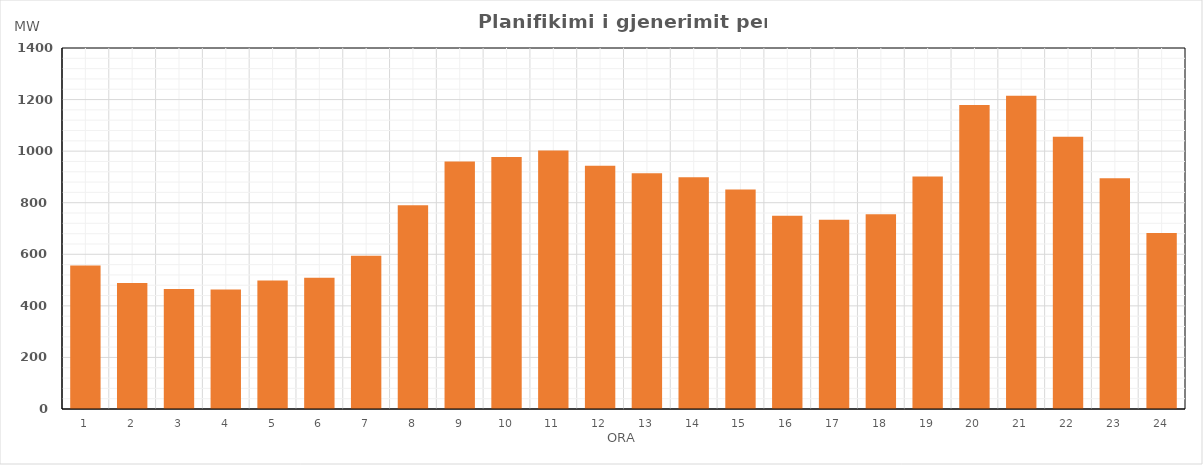
| Category | Max (MW) |
|---|---|
| 0 | 556.52 |
| 1 | 488.35 |
| 2 | 464.94 |
| 3 | 463.04 |
| 4 | 498.23 |
| 5 | 509.23 |
| 6 | 594.12 |
| 7 | 789.95 |
| 8 | 959.91 |
| 9 | 977.61 |
| 10 | 1002.05 |
| 11 | 942.94 |
| 12 | 914.17 |
| 13 | 898.64 |
| 14 | 851.67 |
| 15 | 749.88 |
| 16 | 733.47 |
| 17 | 754.9 |
| 18 | 901.42 |
| 19 | 1179.23 |
| 20 | 1214.54 |
| 21 | 1056.04 |
| 22 | 894.64 |
| 23 | 682.88 |